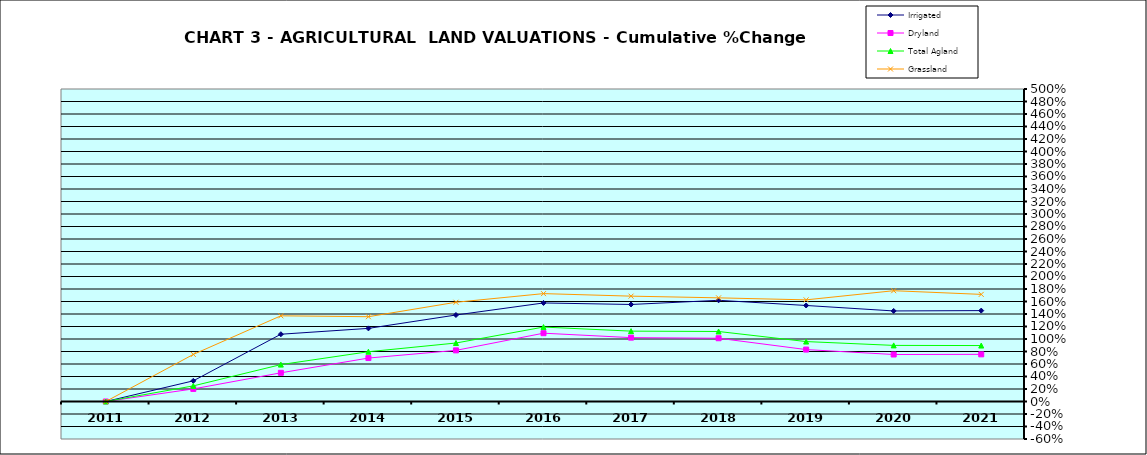
| Category | Irrigated | Dryland | Total Agland | Grassland |
|---|---|---|---|---|
| 2011.0 | 0 | 0 | 0 | 0 |
| 2012.0 | 0.331 | 0.201 | 0.25 | 0.753 |
| 2013.0 | 1.076 | 0.459 | 0.59 | 1.371 |
| 2014.0 | 1.17 | 0.695 | 0.796 | 1.357 |
| 2015.0 | 1.384 | 0.818 | 0.936 | 1.588 |
| 2016.0 | 1.577 | 1.093 | 1.191 | 1.726 |
| 2017.0 | 1.552 | 1.022 | 1.126 | 1.686 |
| 2018.0 | 1.619 | 1.012 | 1.12 | 1.658 |
| 2019.0 | 1.536 | 0.831 | 0.959 | 1.626 |
| 2020.0 | 1.449 | 0.752 | 0.898 | 1.773 |
| 2021.0 | 1.454 | 0.755 | 0.895 | 1.714 |